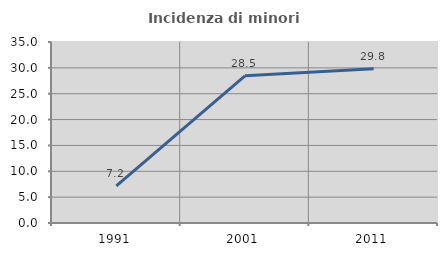
| Category | Incidenza di minori stranieri |
|---|---|
| 1991.0 | 7.2 |
| 2001.0 | 28.458 |
| 2011.0 | 29.837 |